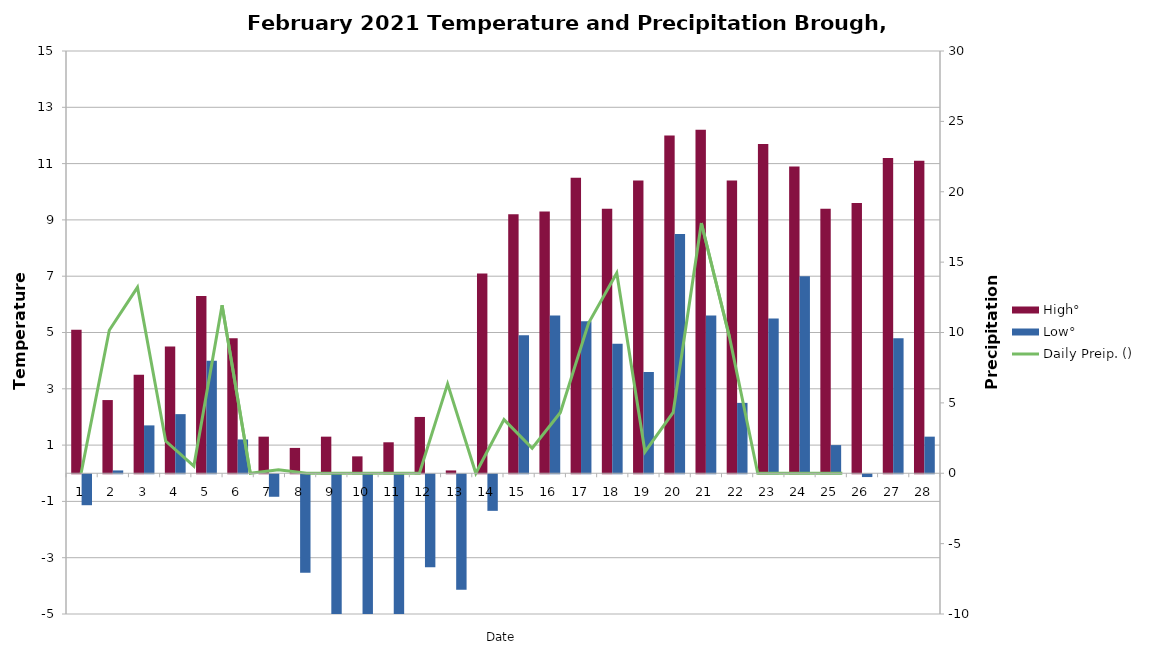
| Category | High° | Low° |
|---|---|---|
| 0 | 5.1 | -1.1 |
| 1 | 2.6 | 0.1 |
| 2 | 3.5 | 1.7 |
| 3 | 4.5 | 2.1 |
| 4 | 6.3 | 4 |
| 5 | 4.8 | 1.2 |
| 6 | 1.3 | -0.8 |
| 7 | 0.9 | -3.5 |
| 8 | 1.3 | -5.8 |
| 9 | 0.6 | -8.3 |
| 10 | 1.1 | -8.4 |
| 11 | 2 | -3.3 |
| 12 | 0.1 | -4.1 |
| 13 | 7.1 | -1.3 |
| 14 | 9.2 | 4.9 |
| 15 | 9.3 | 5.6 |
| 16 | 10.5 | 5.4 |
| 17 | 9.4 | 4.6 |
| 18 | 10.4 | 3.6 |
| 19 | 12 | 8.5 |
| 20 | 12.2 | 5.6 |
| 21 | 10.4 | 2.5 |
| 22 | 11.7 | 5.5 |
| 23 | 10.9 | 7 |
| 24 | 9.4 | 1 |
| 25 | 9.6 | -0.1 |
| 26 | 11.2 | 4.8 |
| 27 | 11.1 | 1.3 |